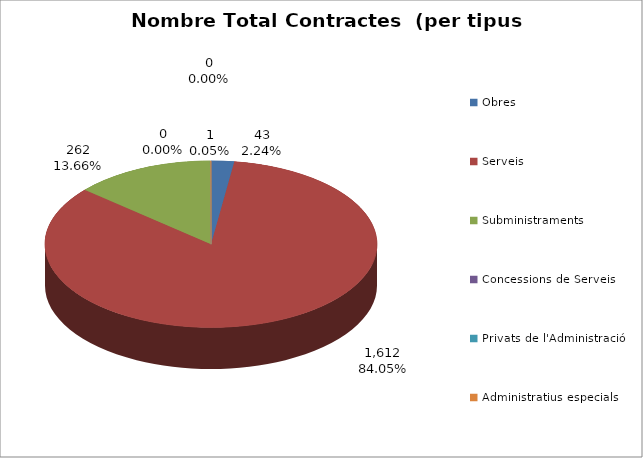
| Category | Nombre Total Contractes |
|---|---|
| Obres | 43 |
| Serveis | 1612 |
| Subministraments | 262 |
| Concessions de Serveis | 0 |
| Privats de l'Administració | 0 |
| Administratius especials | 1 |